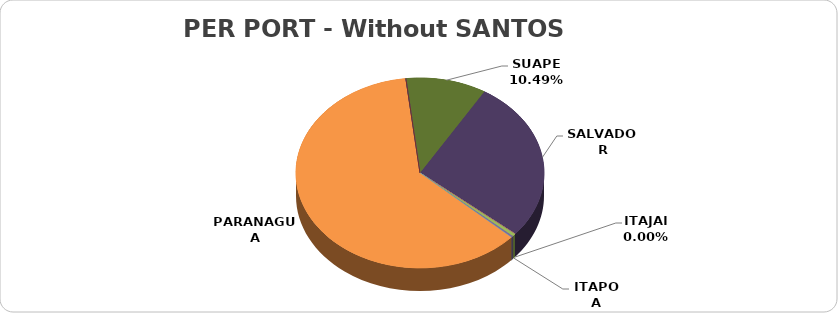
| Category | Series 0 |
|---|---|
| ITAGUAI | 0 |
| ITAJAI | 0 |
| ITAPOA | 162658 |
| MANAUS | 100300 |
| NAVEGANTES | 0 |
| PARANAGUA | 22075258 |
| RIO DE JANEIRO | 15304 |
| RECIFE | 0 |
| SUAPE | 3777124 |
| SALVADOR | 9881517 |
| SAO FRANCISCO DO SUL | 0 |
| RIO GRANDE | 0 |
| VITORIA | 0 |